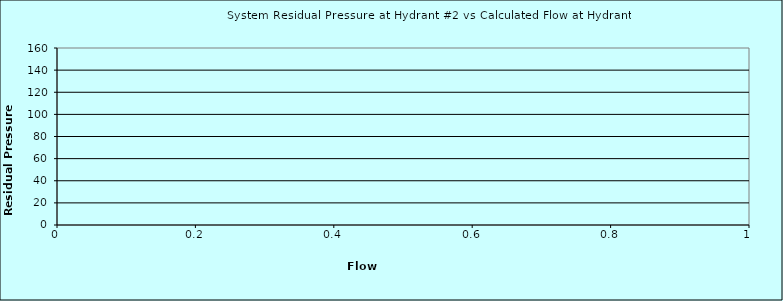
| Category | Flow (gpm) |
|---|---|
| 0.0 | 5 |
| 0.0 | 10 |
| 0.0 | 15 |
| 0.0 | 20 |
| 0.0 | 25 |
| 0.0 | 30 |
| 0.0 | 35 |
| 0.0 | 40 |
| 0.0 | 45 |
| 0.0 | 50 |
| 0.0 | 55 |
| 0.0 | 60 |
| 0.0 | 65 |
| 0.0 | 70 |
| 0.0 | 75 |
| 0.0 | 80 |
| 0.0 | 85 |
| 0.0 | 90 |
| 0.0 | 95 |
| 0.0 | 100 |
| 0.0 | 105 |
| 0.0 | 110 |
| 0.0 | 115 |
| 0.0 | 120 |
| 0.0 | 125 |
| 0.0 | 130 |
| 0.0 | 135 |
| 0.0 | 140 |
| 0.0 | 145 |
| 0.0 | 150 |